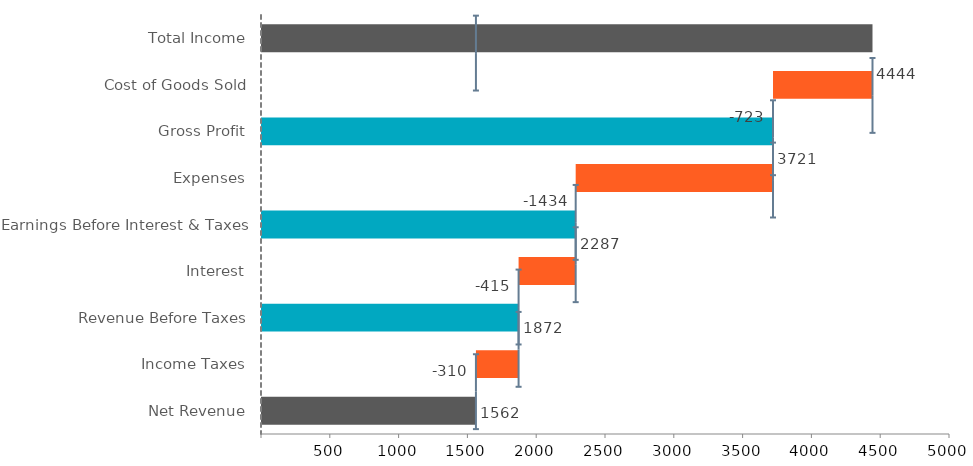
| Category | Ends | Blank | NegLoss | NegGain | PosLoss | PosGain |
|---|---|---|---|---|---|---|
| Total Income | 4444 | 0 | 0 | 0 | 0 | 0 |
| Cost of Goods Sold | 0 | 3721 | 0 | 0 | 723 | 0 |
| Gross Profit | 3721 | 0 | 0 | 0 | 0 | 0 |
| Expenses | 0 | 2287 | 0 | 0 | 1434 | 0 |
| Earnings Before Interest & Taxes | 2287 | 0 | 0 | 0 | 0 | 0 |
| Interest | 0 | 1872 | 0 | 0 | 415 | 0 |
| Revenue Before Taxes | 1872 | 0 | 0 | 0 | 0 | 0 |
| Income Taxes | 0 | 1562 | 0 | 0 | 310 | 0 |
| Net Revenue | 1562 | 0 | 0 | 0 | 0 | 0 |